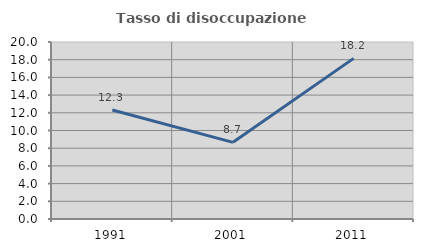
| Category | Tasso di disoccupazione giovanile  |
|---|---|
| 1991.0 | 12.319 |
| 2001.0 | 8.663 |
| 2011.0 | 18.152 |